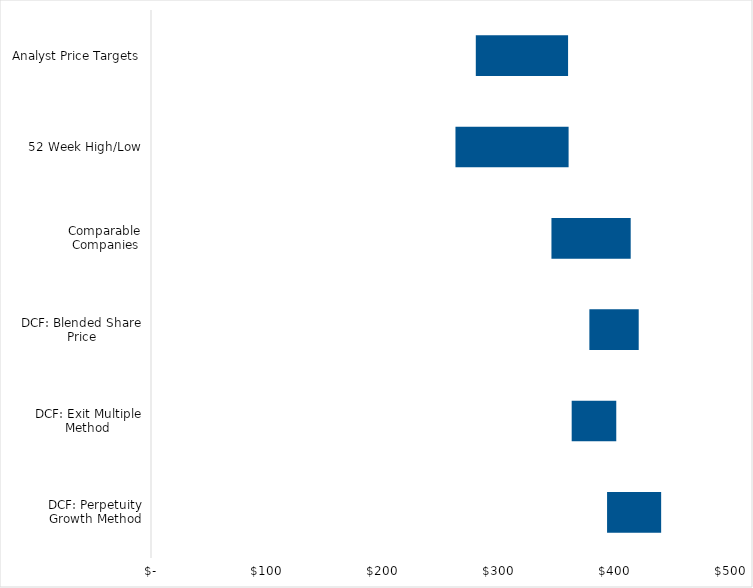
| Category | Low | Spread |
|---|---|---|
| DCF: Perpetuity Growth Method | 393.161 | 46.624 |
| DCF: Exit Multiple Method | 362.655 | 38.436 |
| DCF: Blended Share Price | 377.908 | 42.53 |
| Comparable Companies | 345.213 | 68.319 |
| 52 Week High/Low | 262.47 | 97.53 |
| Analyst Price Targets | 280 | 79.55 |